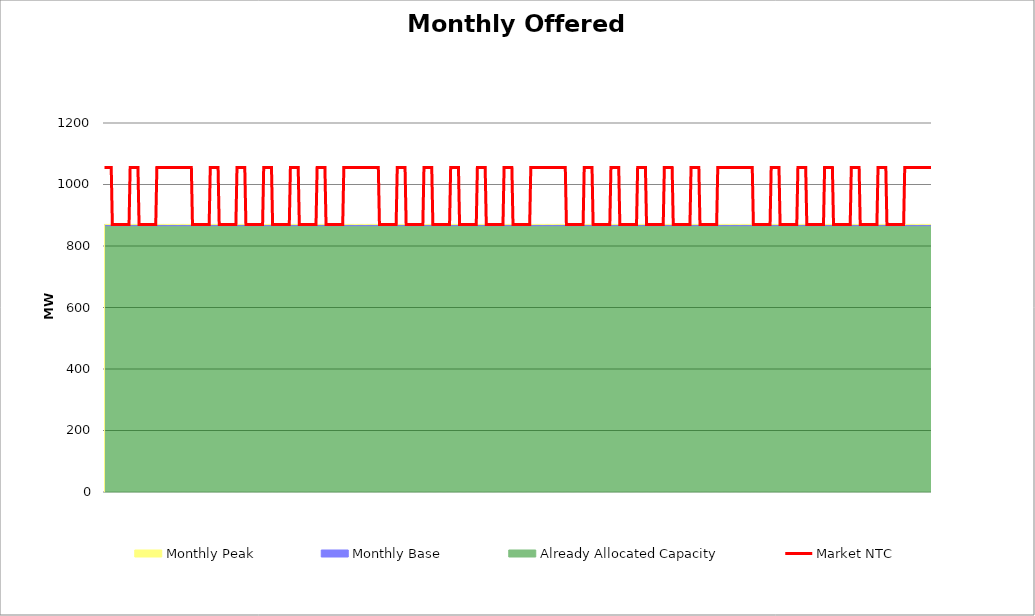
| Category | Market NTC |
|---|---|
| 0 | 1055 |
| 1 | 1055 |
| 2 | 1055 |
| 3 | 1055 |
| 4 | 1055 |
| 5 | 1055 |
| 6 | 1055 |
| 7 | 870 |
| 8 | 870 |
| 9 | 870 |
| 10 | 870 |
| 11 | 870 |
| 12 | 870 |
| 13 | 870 |
| 14 | 870 |
| 15 | 870 |
| 16 | 870 |
| 17 | 870 |
| 18 | 870 |
| 19 | 870 |
| 20 | 870 |
| 21 | 870 |
| 22 | 870 |
| 23 | 1055 |
| 24 | 1055 |
| 25 | 1055 |
| 26 | 1055 |
| 27 | 1055 |
| 28 | 1055 |
| 29 | 1055 |
| 30 | 1055 |
| 31 | 870 |
| 32 | 870 |
| 33 | 870 |
| 34 | 870 |
| 35 | 870 |
| 36 | 870 |
| 37 | 870 |
| 38 | 870 |
| 39 | 870 |
| 40 | 870 |
| 41 | 870 |
| 42 | 870 |
| 43 | 870 |
| 44 | 870 |
| 45 | 870 |
| 46 | 870 |
| 47 | 1055 |
| 48 | 1055 |
| 49 | 1055 |
| 50 | 1055 |
| 51 | 1055 |
| 52 | 1055 |
| 53 | 1055 |
| 54 | 1055 |
| 55 | 1055 |
| 56 | 1055 |
| 57 | 1055 |
| 58 | 1055 |
| 59 | 1055 |
| 60 | 1055 |
| 61 | 1055 |
| 62 | 1055 |
| 63 | 1055 |
| 64 | 1055 |
| 65 | 1055 |
| 66 | 1055 |
| 67 | 1055 |
| 68 | 1055 |
| 69 | 1055 |
| 70 | 1055 |
| 71 | 1055 |
| 72 | 1055 |
| 73 | 1055 |
| 74 | 1055 |
| 75 | 1055 |
| 76 | 1055 |
| 77 | 1055 |
| 78 | 1055 |
| 79 | 870 |
| 80 | 870 |
| 81 | 870 |
| 82 | 870 |
| 83 | 870 |
| 84 | 870 |
| 85 | 870 |
| 86 | 870 |
| 87 | 870 |
| 88 | 870 |
| 89 | 870 |
| 90 | 870 |
| 91 | 870 |
| 92 | 870 |
| 93 | 870 |
| 94 | 870 |
| 95 | 1055 |
| 96 | 1055 |
| 97 | 1055 |
| 98 | 1055 |
| 99 | 1055 |
| 100 | 1055 |
| 101 | 1055 |
| 102 | 1055 |
| 103 | 870 |
| 104 | 870 |
| 105 | 870 |
| 106 | 870 |
| 107 | 870 |
| 108 | 870 |
| 109 | 870 |
| 110 | 870 |
| 111 | 870 |
| 112 | 870 |
| 113 | 870 |
| 114 | 870 |
| 115 | 870 |
| 116 | 870 |
| 117 | 870 |
| 118 | 870 |
| 119 | 1055 |
| 120 | 1055 |
| 121 | 1055 |
| 122 | 1055 |
| 123 | 1055 |
| 124 | 1055 |
| 125 | 1055 |
| 126 | 1055 |
| 127 | 870 |
| 128 | 870 |
| 129 | 870 |
| 130 | 870 |
| 131 | 870 |
| 132 | 870 |
| 133 | 870 |
| 134 | 870 |
| 135 | 870 |
| 136 | 870 |
| 137 | 870 |
| 138 | 870 |
| 139 | 870 |
| 140 | 870 |
| 141 | 870 |
| 142 | 870 |
| 143 | 1055 |
| 144 | 1055 |
| 145 | 1055 |
| 146 | 1055 |
| 147 | 1055 |
| 148 | 1055 |
| 149 | 1055 |
| 150 | 1055 |
| 151 | 870 |
| 152 | 870 |
| 153 | 870 |
| 154 | 870 |
| 155 | 870 |
| 156 | 870 |
| 157 | 870 |
| 158 | 870 |
| 159 | 870 |
| 160 | 870 |
| 161 | 870 |
| 162 | 870 |
| 163 | 870 |
| 164 | 870 |
| 165 | 870 |
| 166 | 870 |
| 167 | 1055 |
| 168 | 1055 |
| 169 | 1055 |
| 170 | 1055 |
| 171 | 1055 |
| 172 | 1055 |
| 173 | 1055 |
| 174 | 1055 |
| 175 | 870 |
| 176 | 870 |
| 177 | 870 |
| 178 | 870 |
| 179 | 870 |
| 180 | 870 |
| 181 | 870 |
| 182 | 870 |
| 183 | 870 |
| 184 | 870 |
| 185 | 870 |
| 186 | 870 |
| 187 | 870 |
| 188 | 870 |
| 189 | 870 |
| 190 | 870 |
| 191 | 1055 |
| 192 | 1055 |
| 193 | 1055 |
| 194 | 1055 |
| 195 | 1055 |
| 196 | 1055 |
| 197 | 1055 |
| 198 | 1055 |
| 199 | 870 |
| 200 | 870 |
| 201 | 870 |
| 202 | 870 |
| 203 | 870 |
| 204 | 870 |
| 205 | 870 |
| 206 | 870 |
| 207 | 870 |
| 208 | 870 |
| 209 | 870 |
| 210 | 870 |
| 211 | 870 |
| 212 | 870 |
| 213 | 870 |
| 214 | 870 |
| 215 | 1055 |
| 216 | 1055 |
| 217 | 1055 |
| 218 | 1055 |
| 219 | 1055 |
| 220 | 1055 |
| 221 | 1055 |
| 222 | 1055 |
| 223 | 1055 |
| 224 | 1055 |
| 225 | 1055 |
| 226 | 1055 |
| 227 | 1055 |
| 228 | 1055 |
| 229 | 1055 |
| 230 | 1055 |
| 231 | 1055 |
| 232 | 1055 |
| 233 | 1055 |
| 234 | 1055 |
| 235 | 1055 |
| 236 | 1055 |
| 237 | 1055 |
| 238 | 1055 |
| 239 | 1055 |
| 240 | 1055 |
| 241 | 1055 |
| 242 | 1055 |
| 243 | 1055 |
| 244 | 1055 |
| 245 | 1055 |
| 246 | 1055 |
| 247 | 870 |
| 248 | 870 |
| 249 | 870 |
| 250 | 870 |
| 251 | 870 |
| 252 | 870 |
| 253 | 870 |
| 254 | 870 |
| 255 | 870 |
| 256 | 870 |
| 257 | 870 |
| 258 | 870 |
| 259 | 870 |
| 260 | 870 |
| 261 | 870 |
| 262 | 870 |
| 263 | 1055 |
| 264 | 1055 |
| 265 | 1055 |
| 266 | 1055 |
| 267 | 1055 |
| 268 | 1055 |
| 269 | 1055 |
| 270 | 1055 |
| 271 | 870 |
| 272 | 870 |
| 273 | 870 |
| 274 | 870 |
| 275 | 870 |
| 276 | 870 |
| 277 | 870 |
| 278 | 870 |
| 279 | 870 |
| 280 | 870 |
| 281 | 870 |
| 282 | 870 |
| 283 | 870 |
| 284 | 870 |
| 285 | 870 |
| 286 | 870 |
| 287 | 1055 |
| 288 | 1055 |
| 289 | 1055 |
| 290 | 1055 |
| 291 | 1055 |
| 292 | 1055 |
| 293 | 1055 |
| 294 | 1055 |
| 295 | 870 |
| 296 | 870 |
| 297 | 870 |
| 298 | 870 |
| 299 | 870 |
| 300 | 870 |
| 301 | 870 |
| 302 | 870 |
| 303 | 870 |
| 304 | 870 |
| 305 | 870 |
| 306 | 870 |
| 307 | 870 |
| 308 | 870 |
| 309 | 870 |
| 310 | 870 |
| 311 | 1055 |
| 312 | 1055 |
| 313 | 1055 |
| 314 | 1055 |
| 315 | 1055 |
| 316 | 1055 |
| 317 | 1055 |
| 318 | 1055 |
| 319 | 870 |
| 320 | 870 |
| 321 | 870 |
| 322 | 870 |
| 323 | 870 |
| 324 | 870 |
| 325 | 870 |
| 326 | 870 |
| 327 | 870 |
| 328 | 870 |
| 329 | 870 |
| 330 | 870 |
| 331 | 870 |
| 332 | 870 |
| 333 | 870 |
| 334 | 870 |
| 335 | 1055 |
| 336 | 1055 |
| 337 | 1055 |
| 338 | 1055 |
| 339 | 1055 |
| 340 | 1055 |
| 341 | 1055 |
| 342 | 1055 |
| 343 | 870 |
| 344 | 870 |
| 345 | 870 |
| 346 | 870 |
| 347 | 870 |
| 348 | 870 |
| 349 | 870 |
| 350 | 870 |
| 351 | 870 |
| 352 | 870 |
| 353 | 870 |
| 354 | 870 |
| 355 | 870 |
| 356 | 870 |
| 357 | 870 |
| 358 | 870 |
| 359 | 1055 |
| 360 | 1055 |
| 361 | 1055 |
| 362 | 1055 |
| 363 | 1055 |
| 364 | 1055 |
| 365 | 1055 |
| 366 | 1055 |
| 367 | 870 |
| 368 | 870 |
| 369 | 870 |
| 370 | 870 |
| 371 | 870 |
| 372 | 870 |
| 373 | 870 |
| 374 | 870 |
| 375 | 870 |
| 376 | 870 |
| 377 | 870 |
| 378 | 870 |
| 379 | 870 |
| 380 | 870 |
| 381 | 870 |
| 382 | 870 |
| 383 | 1055 |
| 384 | 1055 |
| 385 | 1055 |
| 386 | 1055 |
| 387 | 1055 |
| 388 | 1055 |
| 389 | 1055 |
| 390 | 1055 |
| 391 | 1055 |
| 392 | 1055 |
| 393 | 1055 |
| 394 | 1055 |
| 395 | 1055 |
| 396 | 1055 |
| 397 | 1055 |
| 398 | 1055 |
| 399 | 1055 |
| 400 | 1055 |
| 401 | 1055 |
| 402 | 1055 |
| 403 | 1055 |
| 404 | 1055 |
| 405 | 1055 |
| 406 | 1055 |
| 407 | 1055 |
| 408 | 1055 |
| 409 | 1055 |
| 410 | 1055 |
| 411 | 1055 |
| 412 | 1055 |
| 413 | 1055 |
| 414 | 1055 |
| 415 | 870 |
| 416 | 870 |
| 417 | 870 |
| 418 | 870 |
| 419 | 870 |
| 420 | 870 |
| 421 | 870 |
| 422 | 870 |
| 423 | 870 |
| 424 | 870 |
| 425 | 870 |
| 426 | 870 |
| 427 | 870 |
| 428 | 870 |
| 429 | 870 |
| 430 | 870 |
| 431 | 1055 |
| 432 | 1055 |
| 433 | 1055 |
| 434 | 1055 |
| 435 | 1055 |
| 436 | 1055 |
| 437 | 1055 |
| 438 | 1055 |
| 439 | 870 |
| 440 | 870 |
| 441 | 870 |
| 442 | 870 |
| 443 | 870 |
| 444 | 870 |
| 445 | 870 |
| 446 | 870 |
| 447 | 870 |
| 448 | 870 |
| 449 | 870 |
| 450 | 870 |
| 451 | 870 |
| 452 | 870 |
| 453 | 870 |
| 454 | 870 |
| 455 | 1055 |
| 456 | 1055 |
| 457 | 1055 |
| 458 | 1055 |
| 459 | 1055 |
| 460 | 1055 |
| 461 | 1055 |
| 462 | 1055 |
| 463 | 870 |
| 464 | 870 |
| 465 | 870 |
| 466 | 870 |
| 467 | 870 |
| 468 | 870 |
| 469 | 870 |
| 470 | 870 |
| 471 | 870 |
| 472 | 870 |
| 473 | 870 |
| 474 | 870 |
| 475 | 870 |
| 476 | 870 |
| 477 | 870 |
| 478 | 870 |
| 479 | 1055 |
| 480 | 1055 |
| 481 | 1055 |
| 482 | 1055 |
| 483 | 1055 |
| 484 | 1055 |
| 485 | 1055 |
| 486 | 1055 |
| 487 | 870 |
| 488 | 870 |
| 489 | 870 |
| 490 | 870 |
| 491 | 870 |
| 492 | 870 |
| 493 | 870 |
| 494 | 870 |
| 495 | 870 |
| 496 | 870 |
| 497 | 870 |
| 498 | 870 |
| 499 | 870 |
| 500 | 870 |
| 501 | 870 |
| 502 | 870 |
| 503 | 1055 |
| 504 | 1055 |
| 505 | 1055 |
| 506 | 1055 |
| 507 | 1055 |
| 508 | 1055 |
| 509 | 1055 |
| 510 | 1055 |
| 511 | 870 |
| 512 | 870 |
| 513 | 870 |
| 514 | 870 |
| 515 | 870 |
| 516 | 870 |
| 517 | 870 |
| 518 | 870 |
| 519 | 870 |
| 520 | 870 |
| 521 | 870 |
| 522 | 870 |
| 523 | 870 |
| 524 | 870 |
| 525 | 870 |
| 526 | 870 |
| 527 | 1055 |
| 528 | 1055 |
| 529 | 1055 |
| 530 | 1055 |
| 531 | 1055 |
| 532 | 1055 |
| 533 | 1055 |
| 534 | 1055 |
| 535 | 870 |
| 536 | 870 |
| 537 | 870 |
| 538 | 870 |
| 539 | 870 |
| 540 | 870 |
| 541 | 870 |
| 542 | 870 |
| 543 | 870 |
| 544 | 870 |
| 545 | 870 |
| 546 | 870 |
| 547 | 870 |
| 548 | 870 |
| 549 | 870 |
| 550 | 870 |
| 551 | 1055 |
| 552 | 1055 |
| 553 | 1055 |
| 554 | 1055 |
| 555 | 1055 |
| 556 | 1055 |
| 557 | 1055 |
| 558 | 1055 |
| 559 | 1055 |
| 560 | 1055 |
| 561 | 1055 |
| 562 | 1055 |
| 563 | 1055 |
| 564 | 1055 |
| 565 | 1055 |
| 566 | 1055 |
| 567 | 1055 |
| 568 | 1055 |
| 569 | 1055 |
| 570 | 1055 |
| 571 | 1055 |
| 572 | 1055 |
| 573 | 1055 |
| 574 | 1055 |
| 575 | 1055 |
| 576 | 1055 |
| 577 | 1055 |
| 578 | 1055 |
| 579 | 1055 |
| 580 | 1055 |
| 581 | 1055 |
| 582 | 1055 |
| 583 | 870 |
| 584 | 870 |
| 585 | 870 |
| 586 | 870 |
| 587 | 870 |
| 588 | 870 |
| 589 | 870 |
| 590 | 870 |
| 591 | 870 |
| 592 | 870 |
| 593 | 870 |
| 594 | 870 |
| 595 | 870 |
| 596 | 870 |
| 597 | 870 |
| 598 | 870 |
| 599 | 1055 |
| 600 | 1055 |
| 601 | 1055 |
| 602 | 1055 |
| 603 | 1055 |
| 604 | 1055 |
| 605 | 1055 |
| 606 | 1055 |
| 607 | 870 |
| 608 | 870 |
| 609 | 870 |
| 610 | 870 |
| 611 | 870 |
| 612 | 870 |
| 613 | 870 |
| 614 | 870 |
| 615 | 870 |
| 616 | 870 |
| 617 | 870 |
| 618 | 870 |
| 619 | 870 |
| 620 | 870 |
| 621 | 870 |
| 622 | 870 |
| 623 | 1055 |
| 624 | 1055 |
| 625 | 1055 |
| 626 | 1055 |
| 627 | 1055 |
| 628 | 1055 |
| 629 | 1055 |
| 630 | 1055 |
| 631 | 870 |
| 632 | 870 |
| 633 | 870 |
| 634 | 870 |
| 635 | 870 |
| 636 | 870 |
| 637 | 870 |
| 638 | 870 |
| 639 | 870 |
| 640 | 870 |
| 641 | 870 |
| 642 | 870 |
| 643 | 870 |
| 644 | 870 |
| 645 | 870 |
| 646 | 870 |
| 647 | 1055 |
| 648 | 1055 |
| 649 | 1055 |
| 650 | 1055 |
| 651 | 1055 |
| 652 | 1055 |
| 653 | 1055 |
| 654 | 1055 |
| 655 | 870 |
| 656 | 870 |
| 657 | 870 |
| 658 | 870 |
| 659 | 870 |
| 660 | 870 |
| 661 | 870 |
| 662 | 870 |
| 663 | 870 |
| 664 | 870 |
| 665 | 870 |
| 666 | 870 |
| 667 | 870 |
| 668 | 870 |
| 669 | 870 |
| 670 | 870 |
| 671 | 1055 |
| 672 | 1055 |
| 673 | 1055 |
| 674 | 1055 |
| 675 | 1055 |
| 676 | 1055 |
| 677 | 1055 |
| 678 | 1055 |
| 679 | 870 |
| 680 | 870 |
| 681 | 870 |
| 682 | 870 |
| 683 | 870 |
| 684 | 870 |
| 685 | 870 |
| 686 | 870 |
| 687 | 870 |
| 688 | 870 |
| 689 | 870 |
| 690 | 870 |
| 691 | 870 |
| 692 | 870 |
| 693 | 870 |
| 694 | 870 |
| 695 | 1055 |
| 696 | 1055 |
| 697 | 1055 |
| 698 | 1055 |
| 699 | 1055 |
| 700 | 1055 |
| 701 | 1055 |
| 702 | 1055 |
| 703 | 870 |
| 704 | 870 |
| 705 | 870 |
| 706 | 870 |
| 707 | 870 |
| 708 | 870 |
| 709 | 870 |
| 710 | 870 |
| 711 | 870 |
| 712 | 870 |
| 713 | 870 |
| 714 | 870 |
| 715 | 870 |
| 716 | 870 |
| 717 | 870 |
| 718 | 870 |
| 719 | 1055 |
| 720 | 1055 |
| 721 | 1055 |
| 722 | 1055 |
| 723 | 1055 |
| 724 | 1055 |
| 725 | 1055 |
| 726 | 1055 |
| 727 | 1055 |
| 728 | 1055 |
| 729 | 1055 |
| 730 | 1055 |
| 731 | 1055 |
| 732 | 1055 |
| 733 | 1055 |
| 734 | 1055 |
| 735 | 1055 |
| 736 | 1055 |
| 737 | 1055 |
| 738 | 1055 |
| 739 | 1055 |
| 740 | 1055 |
| 741 | 1055 |
| 742 | 1055 |
| 743 | 1055 |